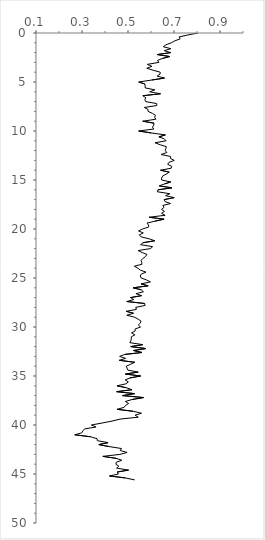
| Category | Series 0 |
|---|---|
| 0.8044 | 0 |
| 0.7604 | 0.2 |
| 0.7222 | 0.4 |
| 0.7266 | 0.6 |
| 0.7038 | 0.8 |
| 0.6885 | 1 |
| 0.6653 | 1.2 |
| 0.6534 | 1.4 |
| 0.6865 | 1.6 |
| 0.6573 | 1.8 |
| 0.6858 | 2 |
| 0.6269 | 2.2 |
| 0.6815 | 2.4 |
| 0.649 | 2.6 |
| 0.6281 | 2.8 |
| 0.6344 | 3 |
| 0.5837 | 3.2 |
| 0.604 | 3.4 |
| 0.5817 | 3.6 |
| 0.6095 | 3.8 |
| 0.6402 | 4 |
| 0.6393 | 4.2 |
| 0.6267 | 4.4 |
| 0.6587 | 4.6 |
| 0.6028 | 4.8 |
| 0.5466 | 5 |
| 0.573 | 5.2 |
| 0.5747 | 5.4 |
| 0.5745 | 5.6 |
| 0.6168 | 5.8 |
| 0.5942 | 6 |
| 0.6416 | 6.2 |
| 0.5645 | 6.4 |
| 0.5774 | 6.6 |
| 0.5735 | 6.8 |
| 0.5764 | 7 |
| 0.6246 | 7.2 |
| 0.6253 | 7.4 |
| 0.5709 | 7.6 |
| 0.587 | 7.8 |
| 0.5873 | 8 |
| 0.6061 | 8.2 |
| 0.6196 | 8.4 |
| 0.6156 | 8.6 |
| 0.621 | 8.8 |
| 0.564 | 9 |
| 0.613 | 9.2 |
| 0.6121 | 9.4 |
| 0.6064 | 9.6 |
| 0.6121 | 9.8 |
| 0.5462 | 10 |
| 0.6014 | 10.2 |
| 0.6626 | 10.4 |
| 0.6342 | 10.6 |
| 0.6573 | 10.8 |
| 0.6658 | 11 |
| 0.6175 | 11.2 |
| 0.64 | 11.4 |
| 0.6667 | 11.6 |
| 0.6647 | 11.8 |
| 0.6619 | 12 |
| 0.6688 | 12.2 |
| 0.6439 | 12.4 |
| 0.6849 | 12.6 |
| 0.6847 | 12.8 |
| 0.7011 | 13 |
| 0.6779 | 13.2 |
| 0.6726 | 13.4 |
| 0.6899 | 13.6 |
| 0.6876 | 13.8 |
| 0.6414 | 14 |
| 0.6795 | 14.2 |
| 0.666 | 14.4 |
| 0.6504 | 14.6 |
| 0.6462 | 14.8 |
| 0.646 | 15 |
| 0.6858 | 15.2 |
| 0.6589 | 15.4 |
| 0.636 | 15.6 |
| 0.6908 | 15.8 |
| 0.6302 | 16 |
| 0.6274 | 16.2 |
| 0.682 | 16.4 |
| 0.6635 | 16.6 |
| 0.7009 | 16.8 |
| 0.6571 | 17 |
| 0.6612 | 17.2 |
| 0.6849 | 17.4 |
| 0.6518 | 17.6 |
| 0.6562 | 17.8 |
| 0.646 | 18 |
| 0.6587 | 18.2 |
| 0.6458 | 18.4 |
| 0.6614 | 18.6 |
| 0.5916 | 18.8 |
| 0.6569 | 19 |
| 0.6168 | 19.2 |
| 0.5825 | 19.4 |
| 0.5892 | 19.6 |
| 0.5897 | 19.8 |
| 0.5631 | 20 |
| 0.5459 | 20.2 |
| 0.5665 | 20.4 |
| 0.5494 | 20.6 |
| 0.5565 | 20.8 |
| 0.5916 | 21 |
| 0.6163 | 21.2 |
| 0.565 | 21.4 |
| 0.5545 | 21.6 |
| 0.6071 | 21.8 |
| 0.5981 | 22 |
| 0.5439 | 22.2 |
| 0.5614 | 22.4 |
| 0.5825 | 22.6 |
| 0.5762 | 22.8 |
| 0.5653 | 23 |
| 0.557 | 23.2 |
| 0.5597 | 23.4 |
| 0.5606 | 23.6 |
| 0.5273 | 23.8 |
| 0.5432 | 24 |
| 0.5538 | 24.2 |
| 0.5784 | 24.4 |
| 0.5577 | 24.6 |
| 0.5535 | 24.8 |
| 0.5572 | 25 |
| 0.5808 | 25.2 |
| 0.5976 | 25.4 |
| 0.5565 | 25.6 |
| 0.5875 | 25.8 |
| 0.5223 | 26 |
| 0.5572 | 26.2 |
| 0.5672 | 26.4 |
| 0.5345 | 26.6 |
| 0.5592 | 26.8 |
| 0.511 | 27 |
| 0.5253 | 27.2 |
| 0.4946 | 27.4 |
| 0.5723 | 27.6 |
| 0.5743 | 27.8 |
| 0.5335 | 28 |
| 0.5368 | 28.2 |
| 0.4923 | 28.4 |
| 0.5238 | 28.6 |
| 0.4948 | 28.8 |
| 0.5283 | 29 |
| 0.5442 | 29.2 |
| 0.5567 | 29.4 |
| 0.5538 | 29.6 |
| 0.5449 | 29.8 |
| 0.5543 | 30 |
| 0.531 | 30.2 |
| 0.5313 | 30.4 |
| 0.5155 | 30.6 |
| 0.5301 | 30.8 |
| 0.5143 | 31 |
| 0.5145 | 31.2 |
| 0.5123 | 31.4 |
| 0.508 | 31.6 |
| 0.5648 | 31.8 |
| 0.512 | 32 |
| 0.5781 | 32.2 |
| 0.5238 | 32.4 |
| 0.5609 | 32.6 |
| 0.4859 | 32.8 |
| 0.4637 | 33 |
| 0.4895 | 33.2 |
| 0.4622 | 33.4 |
| 0.5293 | 33.6 |
| 0.5113 | 33.8 |
| 0.493 | 34 |
| 0.4958 | 34.2 |
| 0.4994 | 34.4 |
| 0.5444 | 34.6 |
| 0.4889 | 34.8 |
| 0.5548 | 35 |
| 0.5077 | 35.2 |
| 0.4877 | 35.4 |
| 0.5014 | 35.6 |
| 0.4912 | 35.8 |
| 0.4525 | 36 |
| 0.493 | 36.2 |
| 0.5173 | 36.4 |
| 0.4507 | 36.6 |
| 0.5288 | 36.8 |
| 0.4764 | 37 |
| 0.5677 | 37.2 |
| 0.5178 | 37.4 |
| 0.4882 | 37.6 |
| 0.5029 | 37.8 |
| 0.4892 | 38 |
| 0.4831 | 38.2 |
| 0.4525 | 38.4 |
| 0.5223 | 38.6 |
| 0.5587 | 38.8 |
| 0.5308 | 39 |
| 0.5447 | 39.2 |
| 0.465 | 39.4 |
| 0.4304 | 39.6 |
| 0.3869 | 39.8 |
| 0.3405 | 40 |
| 0.3611 | 40.2 |
| 0.3111 | 40.4 |
| 0.304 | 40.6 |
| 0.2988 | 40.8 |
| 0.2686 | 41 |
| 0.3374 | 41.2 |
| 0.3658 | 41.4 |
| 0.3664 | 41.6 |
| 0.4134 | 41.8 |
| 0.3732 | 42 |
| 0.4174 | 42.2 |
| 0.4717 | 42.4 |
| 0.466 | 42.6 |
| 0.4961 | 42.8 |
| 0.465 | 43 |
| 0.3905 | 43.2 |
| 0.4478 | 43.4 |
| 0.4733 | 43.6 |
| 0.4494 | 43.8 |
| 0.4473 | 44 |
| 0.4598 | 44.2 |
| 0.4504 | 44.4 |
| 0.5024 | 44.6 |
| 0.4528 | 44.8 |
| 0.4585 | 45 |
| 0.4195 | 45.2 |
| 0.4879 | 45.4 |
| 0.5291 | 45.6 |